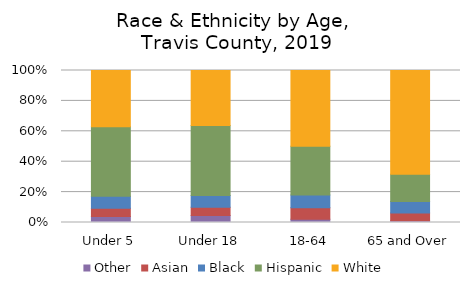
| Category | Other | Asian | Black | Hispanic | White |
|---|---|---|---|---|---|
| Under 5 | 0.04 | 0.054 | 0.079 | 0.457 | 0.37 |
| Under 18 | 0.045 | 0.055 | 0.077 | 0.46 | 0.362 |
| 18-64 | 0.021 | 0.075 | 0.084 | 0.321 | 0.498 |
| 65 and Over | 0.011 | 0.051 | 0.076 | 0.181 | 0.682 |